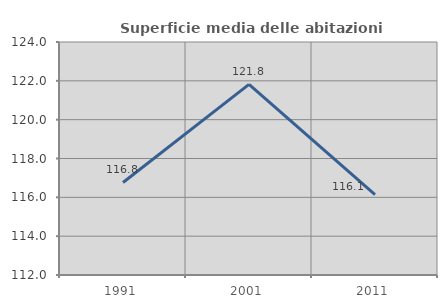
| Category | Superficie media delle abitazioni occupate |
|---|---|
| 1991.0 | 116.765 |
| 2001.0 | 121.818 |
| 2011.0 | 116.139 |